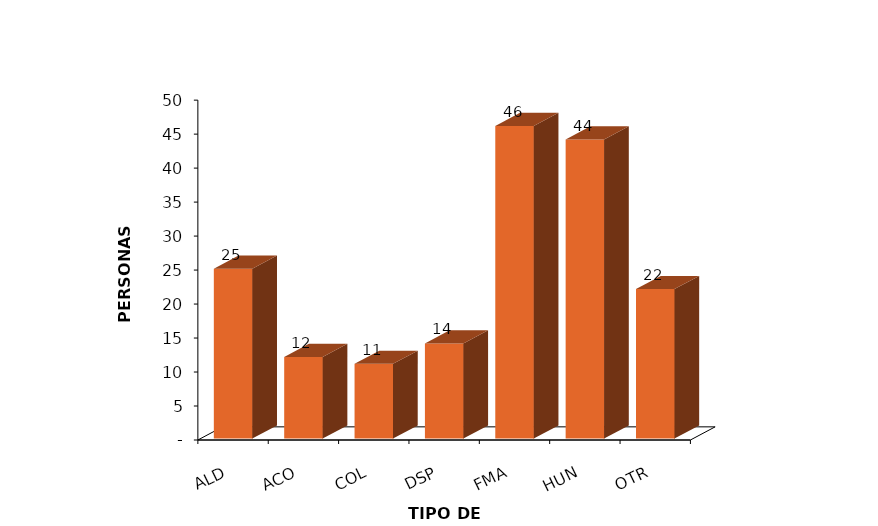
| Category | Series 0 |
|---|---|
| ALD | 25 |
| ACO | 12 |
| COL | 11 |
| DSP | 14 |
| FMA | 46 |
| HUN | 44 |
| OTR | 22 |